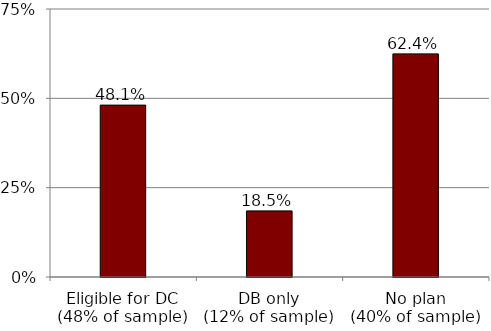
| Category | Series 0 |
|---|---|
| Eligible for DC
(48% of sample) | 0.481 |
| DB only
(12% of sample) | 0.185 |
| No plan
(40% of sample) | 0.624 |